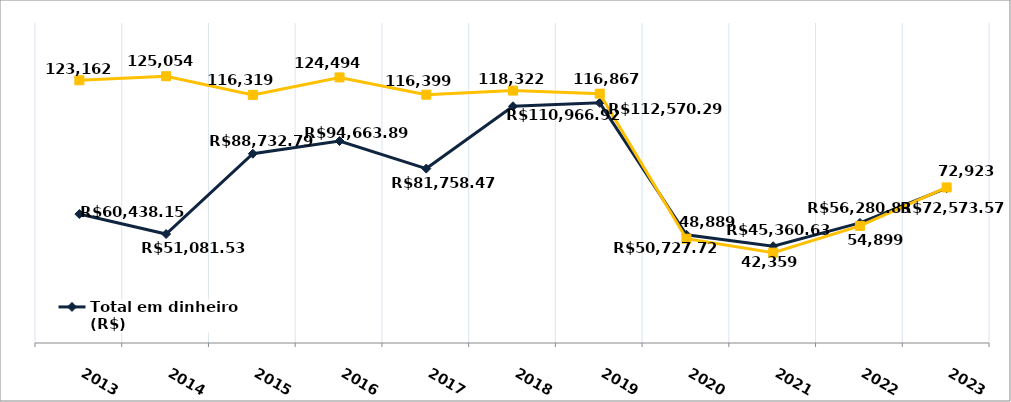
| Category | Total em dinheiro (R$) |
|---|---|
| 2013.0 | 60438.15 |
| 2014.0 | 51081.53 |
| 2015.0 | 88732.79 |
| 2016.0 | 94663.89 |
| 2017.0 | 81758.47 |
| 2018.0 | 110966.92 |
| 2019.0 | 112570.29 |
| 2020.0 | 50727.72 |
| 2021.0 | 45360.63 |
| 2022.0 | 56280.83 |
| 2023.0 | 72573.57 |